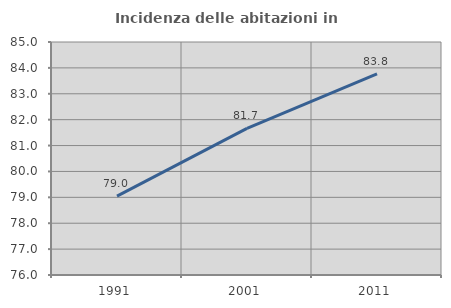
| Category | Incidenza delle abitazioni in proprietà  |
|---|---|
| 1991.0 | 79.047 |
| 2001.0 | 81.662 |
| 2011.0 | 83.772 |